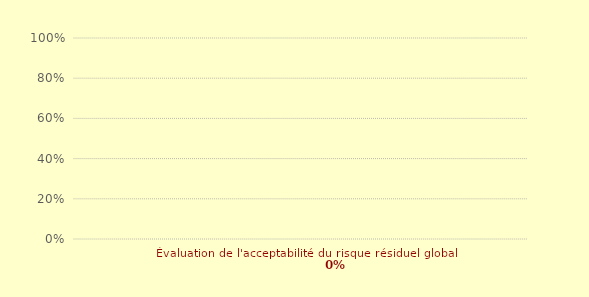
| Category | Art. 7 | Évaluation de l'acceptabilité du risque résiduel global |
|---|---|---|
| Évaluation de l'acceptabilité du risque résiduel global | 0 | 0 |